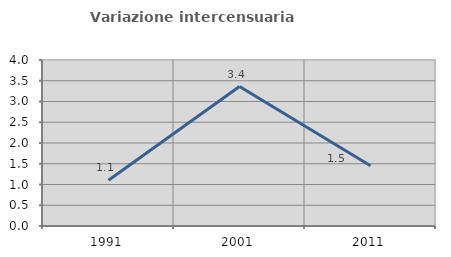
| Category | Variazione intercensuaria annua |
|---|---|
| 1991.0 | 1.104 |
| 2001.0 | 3.36 |
| 2011.0 | 1.453 |